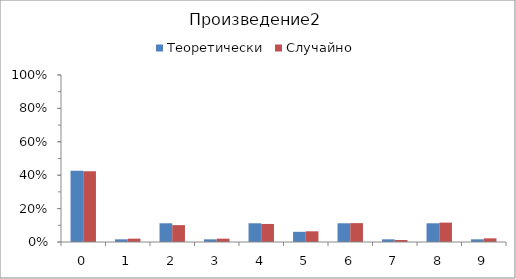
| Category | Теоретически | Случайно |
|---|---|---|
| 0.0 | 0.427 | 0.424 |
| 1.0 | 0.016 | 0.02 |
| 2.0 | 0.112 | 0.101 |
| 3.0 | 0.016 | 0.02 |
| 4.0 | 0.112 | 0.108 |
| 5.0 | 0.061 | 0.064 |
| 6.0 | 0.112 | 0.113 |
| 7.0 | 0.016 | 0.012 |
| 8.0 | 0.112 | 0.116 |
| 9.0 | 0.016 | 0.022 |